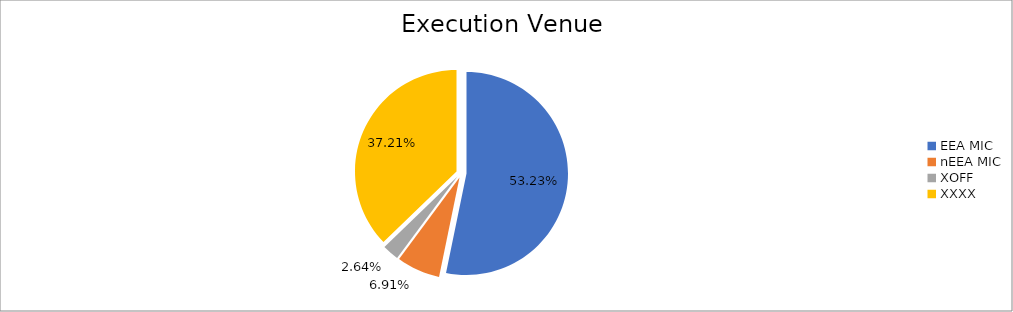
| Category | Series 0 |
|---|---|
| EEA MIC | 5965862.945 |
| nEEA MIC | 774762.801 |
| XOFF | 296256.772 |
| XXXX | 4170449.097 |